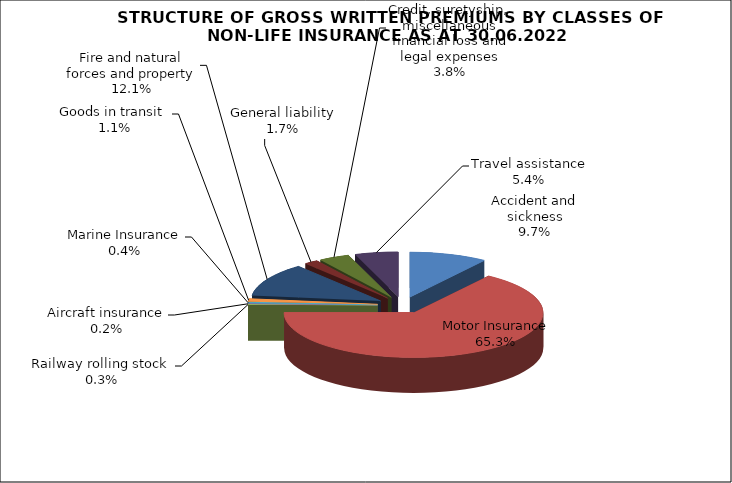
| Category | Accident and sickness |
|---|---|
| Accident and sickness | 0.097 |
| Motor Insurance | 0.653 |
| Railway rolling stock  | 0.003 |
| Aircraft insurance | 0.002 |
| Marine Insurance | 0.004 |
| Goods in transit  | 0.011 |
| Fire and natural forces and property | 0.121 |
| General liability | 0.017 |
| Credit, suretyship, miscellaneous financial loss and legal expenses | 0.038 |
| Travel assistance | 0.054 |